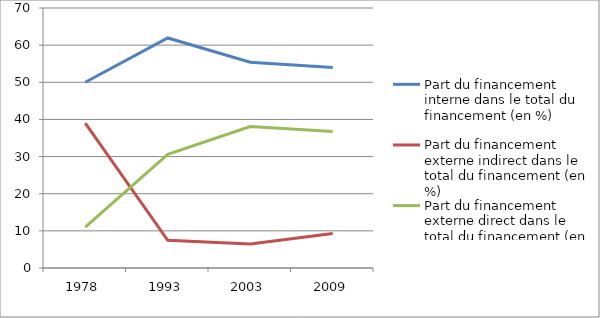
| Category | Part du financement interne dans le total du financement (en %) | Part du financement externe indirect dans le total du financement (en %) | Part du financement externe direct dans le total du financement (en %) |
|---|---|---|---|
| 1978.0 | 50 | 39 | 11 |
| 1993.0 | 61.94 | 7.463 | 30.597 |
| 2003.0 | 55.411 | 6.494 | 38.095 |
| 2009.0 | 53.994 | 9.265 | 36.741 |